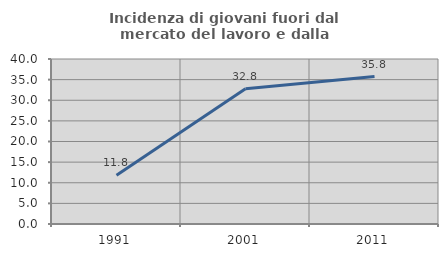
| Category | Incidenza di giovani fuori dal mercato del lavoro e dalla formazione  |
|---|---|
| 1991.0 | 11.828 |
| 2001.0 | 32.812 |
| 2011.0 | 35.758 |